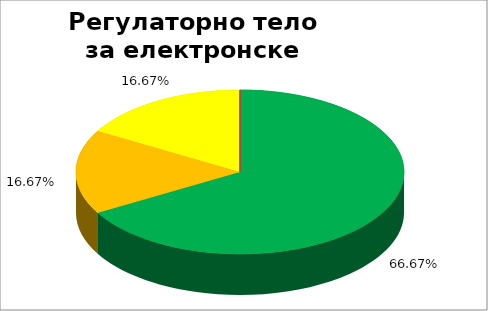
| Category | Регулаторно тело за електронске медије  |
|---|---|
| 0 | 0.667 |
| 1 | 0.167 |
| 2 | 0.167 |
| 3 | 0 |
| 4 | 0 |